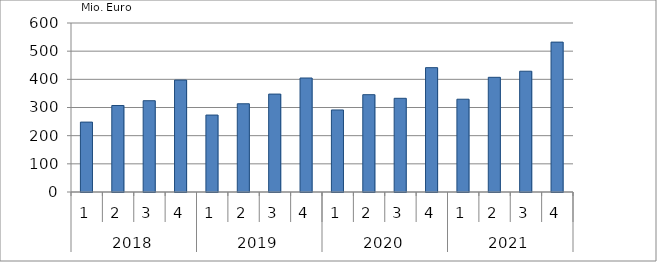
| Category | Ausbaugewerblicher Umsatz3 |
|---|---|
| 0 | 248133.418 |
| 1 | 307099.899 |
| 2 | 324088.989 |
| 3 | 397377.201 |
| 4 | 273159.137 |
| 5 | 313254.251 |
| 6 | 347631.281 |
| 7 | 404721.054 |
| 8 | 291272.144 |
| 9 | 345494.215 |
| 10 | 332629.265 |
| 11 | 441463.36 |
| 12 | 329380.212 |
| 13 | 407164.972 |
| 14 | 428783.222 |
| 15 | 532137.089 |